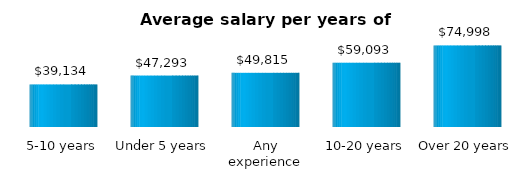
| Category | Average salary per years of experience |
|---|---|
| 5-10 years | 39133.844 |
| Under 5 years | 47292.748 |
| Any experience | 49814.598 |
| 10-20 years | 59092.867 |
| Over 20 years | 74998.095 |